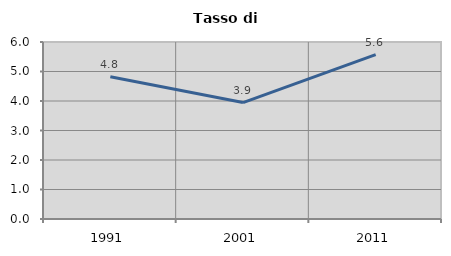
| Category | Tasso di disoccupazione   |
|---|---|
| 1991.0 | 4.824 |
| 2001.0 | 3.946 |
| 2011.0 | 5.569 |